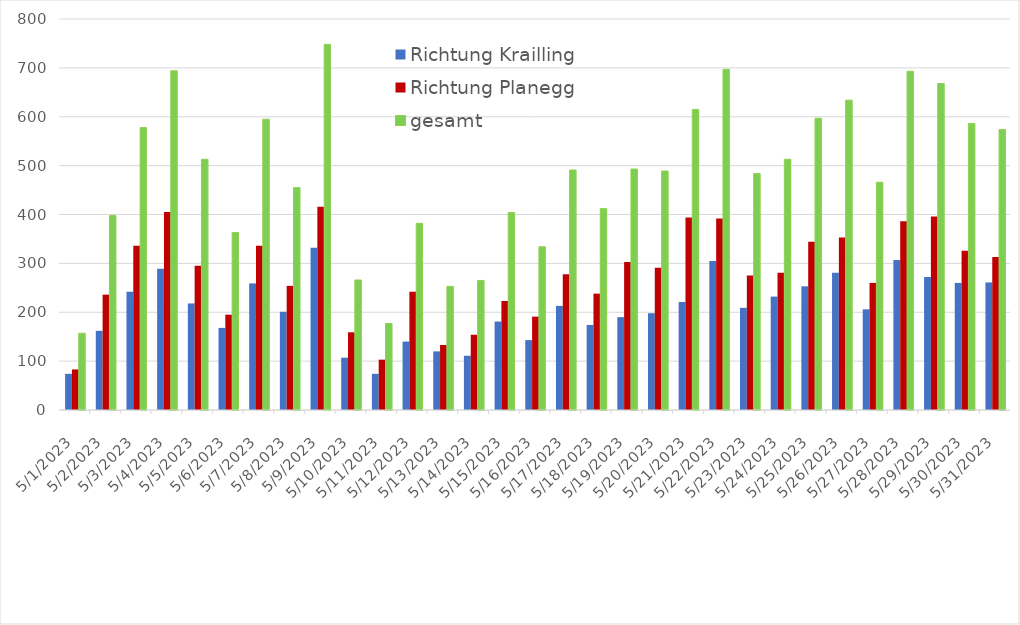
| Category | Richtung Krailling | Richtung Planegg | gesamt |
|---|---|---|---|
| 5/1/23 | 74 | 83 | 157 |
| 5/2/23 | 162 | 236 | 398 |
| 5/3/23 | 242 | 336 | 578 |
| 5/4/23 | 289 | 405 | 694 |
| 5/5/23 | 218 | 295 | 513 |
| 5/6/23 | 168 | 195 | 363 |
| 5/7/23 | 259 | 336 | 595 |
| 5/8/23 | 201 | 254 | 455 |
| 5/9/23 | 332 | 416 | 748 |
| 5/10/23 | 107 | 159 | 266 |
| 5/11/23 | 74 | 103 | 177 |
| 5/12/23 | 140 | 242 | 382 |
| 5/13/23 | 120 | 133 | 253 |
| 5/14/23 | 111 | 154 | 265 |
| 5/15/23 | 181 | 223 | 404 |
| 5/16/23 | 143 | 191 | 334 |
| 5/17/23 | 213 | 278 | 491 |
| 5/18/23 | 174 | 238 | 412 |
| 5/19/23 | 190 | 303 | 493 |
| 5/20/23 | 198 | 291 | 489 |
| 5/21/23 | 221 | 394 | 615 |
| 5/22/23 | 305 | 392 | 697 |
| 5/23/23 | 209 | 275 | 484 |
| 5/24/23 | 232 | 281 | 513 |
| 5/25/23 | 253 | 344 | 597 |
| 5/26/23 | 281 | 353 | 634 |
| 5/27/23 | 206 | 260 | 466 |
| 5/28/23 | 307 | 386 | 693 |
| 5/29/23 | 272 | 396 | 668 |
| 5/30/23 | 260 | 326 | 586 |
| 5/31/23 | 261 | 313 | 574 |